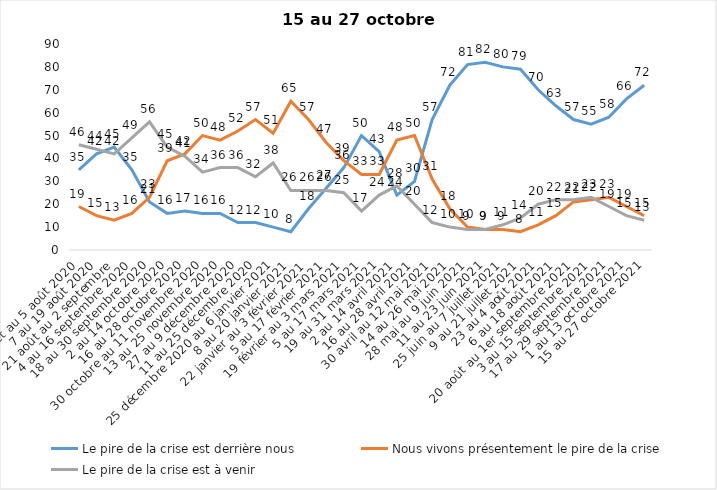
| Category | Le pire de la crise est derrière nous | Nous vivons présentement le pire de la crise | Le pire de la crise est à venir |
|---|---|---|---|
| 24 juillet au 5 août 2020 | 35 | 19 | 46 |
| 7 au 19 août 2020 | 42 | 15 | 44 |
| 21 août au 2 septembre | 45 | 13 | 42 |
| 4 au 16 septembre 2020 | 35 | 16 | 49 |
| 18 au 30 septembre 2020 | 21 | 23 | 56 |
| 2 au 14 octobre 2020 | 16 | 39 | 45 |
| 16 au 28 octobre 2020 | 17 | 42 | 41 |
| 30 octobre au 11 novembre 2020 | 16 | 50 | 34 |
| 13 au 25 novembre 2020 | 16 | 48 | 36 |
| 27 au 9 décembre 2020 | 12 | 52 | 36 |
| 11 au 25 décembre 2020 | 12 | 57 | 32 |
| 25 décembre 2020 au 6 janvier 2021 | 10 | 51 | 38 |
| 8 au 20 janvier 2021 | 8 | 65 | 26 |
| 22 janvier au 3 février 2021 | 18 | 57 | 26 |
| 5 au 17 février 2021 | 27 | 47 | 26 |
| 19 février au 3 mars 2021 | 36 | 39 | 25 |
| 5 au 17 mars 2021 | 50 | 33 | 17 |
| 19 au 31 mars 2021 | 43 | 33 | 24 |
| 2 au 14 avril 2021 | 24 | 48 | 28 |
| 16 au 28 avril 2021 | 30 | 50 | 20 |
| 30 avril au 12 mai 2021 | 57 | 31 | 12 |
| 14 au 26 mai 2021 | 72 | 18 | 10 |
| 28 mai au 9 juin 2021 | 81 | 10 | 9 |
| 11 au 23 juin 2021 | 82 | 9 | 9 |
| 25 juin au 7 juillet 2021 | 80 | 9 | 11 |
| 9 au 21 juillet 2021 | 79 | 8 | 14 |
| 23 au 4 août 2021 | 70 | 11 | 20 |
| 6 au 18 août 2021 | 63 | 15 | 22 |
| 20 août au 1er septembre 2021 | 57 | 21 | 22 |
| 3 au 15 septembre 2021 | 55 | 22 | 23 |
| 17 au 29 septembre 2021 | 58 | 23 | 19 |
| 1 au 13 octobre 2021 | 66 | 19 | 15 |
| 15 au 27 octobre 2021 | 72 | 15 | 13 |